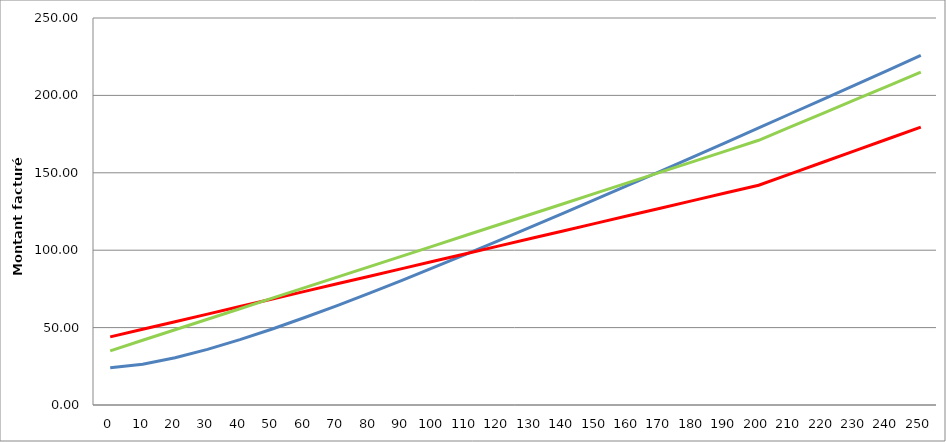
| Category | Simulation | SIBA 2013 | SIBA 2012 | 44,00 48,90 53,80 58,70 63,60 68,50 73,40 78,30 83,20 88,10 93,00 97,90 102,80 107,70 112,60 117,50 122,40 127,30 132,20 137,10 142,00 149,50 157,00 164,50 172,00 179,50 187,00 194,50 202,00 209,50 217,00 224,50 232,00 239,50 247,00 254,50 262,00 269,50 2 |
|---|---|---|---|---|
| 0.0 | 24 | 44 | 35 |  |
| 10.0 | 26.321 | 48.9 | 41.8 |  |
| 20.0 | 30.5 | 53.8 | 48.6 |  |
| 30.0 | 35.917 | 58.7 | 55.4 |  |
| 40.0 | 42.2 | 63.6 | 62.2 |  |
| 50.0 | 49.114 | 68.5 | 69 |  |
| 60.0 | 56.5 | 73.4 | 75.8 |  |
| 70.0 | 64.25 | 78.3 | 82.6 |  |
| 80.0 | 72.286 | 83.2 | 89.4 |  |
| 90.0 | 80.55 | 88.1 | 96.2 |  |
| 100.0 | 89 | 93 | 103 |  |
| 110.0 | 97.603 | 97.9 | 109.8 |  |
| 120.0 | 106.333 | 102.8 | 116.6 |  |
| 130.0 | 115.171 | 107.7 | 123.4 |  |
| 140.0 | 124.1 | 112.6 | 130.2 |  |
| 150.0 | 133.107 | 117.5 | 137 |  |
| 160.0 | 142.182 | 122.4 | 143.8 |  |
| 170.0 | 151.315 | 127.3 | 150.6 |  |
| 180.0 | 160.5 | 132.2 | 157.4 |  |
| 190.0 | 169.73 | 137.1 | 164.2 |  |
| 200.0 | 179 | 142 | 171 |  |
| 210.0 | 188.306 | 149.5 | 179.8 |  |
| 220.0 | 197.643 | 157 | 188.6 |  |
| 230.0 | 207.009 | 164.5 | 197.4 |  |
| 240.0 | 216.4 | 172 | 206.2 |  |
| 250.0 | 225.815 | 179.5 | 215 |  |